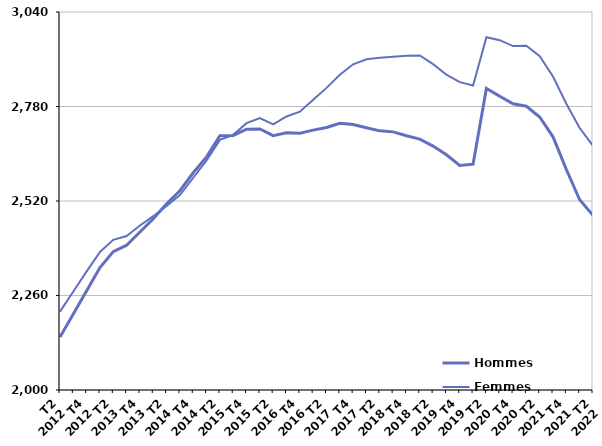
| Category | Hommes  | Femmes  |
|---|---|---|
| T2
2012 | 2145.9 | 2215.7 |
| T3
2012 | 2208.9 | 2271.1 |
| T4
2012 | 2273.2 | 2326.4 |
| T1
2013 | 2336.8 | 2379.6 |
| T2
2013 | 2380.7 | 2413.3 |
| T3
2013 | 2398.4 | 2423.7 |
| T4
2013 | 2434.8 | 2452.7 |
| T1
2014 | 2471.2 | 2478.2 |
| T2
2014 | 2512.3 | 2506.5 |
| T3
2014 | 2548.3 | 2536.3 |
| T4
2014 | 2597.7 | 2584 |
| T1
2015 | 2641.3 | 2631.8 |
| T2
2015 | 2699.5 | 2688.2 |
| T3
2015 | 2700.4 | 2702.1 |
| T4
2015 | 2717.4 | 2734.1 |
| T1
2016 | 2718.3 | 2748.2 |
| T2
2016 | 2699.8 | 2731 |
| T3
2016 | 2707.6 | 2752.5 |
| T4
2016 | 2706.4 | 2765.8 |
| T1
2017 | 2715 | 2798.8 |
| T2
2017 | 2722.1 | 2831.2 |
| T3
2017 | 2733.6 | 2867.2 |
| T4
2017 | 2730.4 | 2896 |
| T1
2018 | 2721.4 | 2910.1 |
| T2
2018 | 2713 | 2913.8 |
| T3
2018 | 2710.2 | 2916.6 |
| T4
2018 | 2699.5 | 2919.5 |
| T1
2019 | 2690.2 | 2920.5 |
| T2
2019 | 2671 | 2896.6 |
| T3
2019 | 2647 | 2867.6 |
| T4
2019 | 2617.8 | 2846.9 |
| T1
2020 | 2621.2 | 2837.8 |
| T2
2020 | 2829.8 | 2970.7 |
| T3
2020 | 2808.2 | 2962.5 |
| T4
2020 | 2787.3 | 2946.3 |
| T1
2021 | 2780.6 | 2947.2 |
| T2
2021 | 2751.2 | 2918.5 |
| T3
2021 | 2696.6 | 2862.6 |
| T4
2021 | 2606.6 | 2787.7 |
| T1
2022 | 2523.3 | 2720.9 |
| T2
2022 | 2480.5 | 2671.7 |